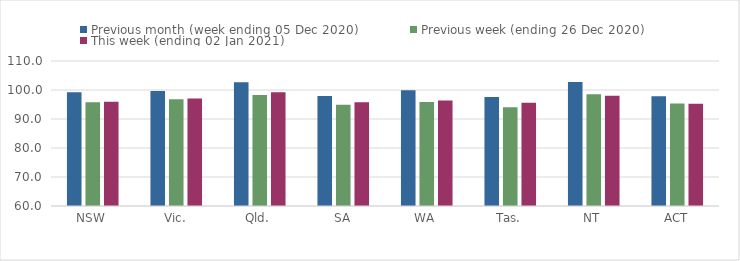
| Category | Previous month (week ending 05 Dec 2020) | Previous week (ending 26 Dec 2020) | This week (ending 02 Jan 2021) |
|---|---|---|---|
| NSW | 99.24 | 95.8 | 95.98 |
| Vic. | 99.64 | 96.78 | 97.04 |
| Qld. | 102.69 | 98.29 | 99.22 |
| SA | 97.93 | 94.92 | 95.81 |
| WA | 99.88 | 95.87 | 96.38 |
| Tas. | 97.57 | 94.05 | 95.57 |
| NT | 102.72 | 98.56 | 98.04 |
| ACT | 97.83 | 95.33 | 95.23 |